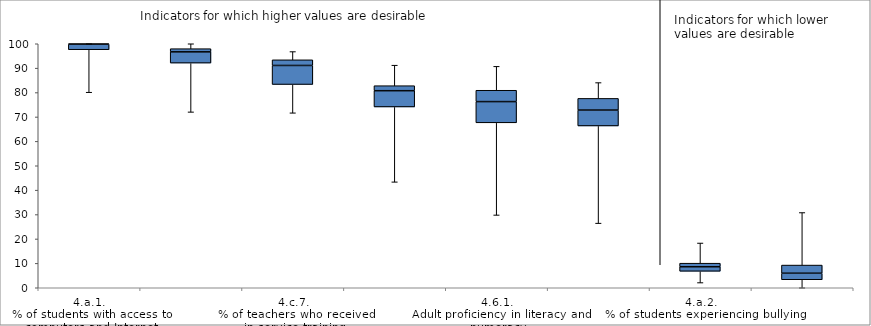
| Category | Q1 | Median-Q1 | Q3-Median |
|---|---|---|---|
| 4.a.1.
% of students with access to computers and Internet | 97.549 | 2.279 | 0.172 |
| 4.2.2.
Enrolment rate a year before primary entry age | 92.077 | 4.617 | 1.292 |
| 4.c.7.
% of teachers who received in-service training | 83.304 | 7.8 | 2.318 |
| 4.7.5.
Proficiency of 15-year-olds in science | 74.105 | 6.652 | 2.057 |
| 4.6.1.
Adult proficiency in literacy and numeracy | 67.591 | 8.696 | 4.66 |
| 4.1.1.
Proficiency of 15-year-olds in maths and reading | 66.322 | 6.504 | 4.784 |
| 4.a.2.
% of students experiencing bullying | 6.749 | 1.863 | 1.455 |
| 4.1.5.
Out-of-school rate | 3.282 | 2.674 | 3.346 |